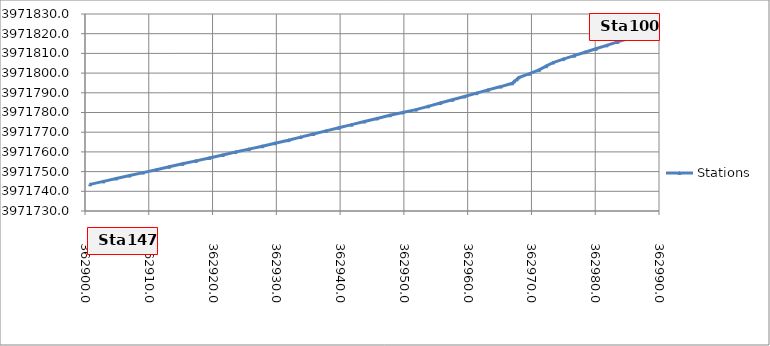
| Category | Stations |
|---|---|
| 362985.2 | 3971817.555 |
| 362983.5 | 3971815.816 |
| 362981.8 | 3971814.076 |
| 362980.1 | 3971812.337 |
| 362978.4 | 3971810.597 |
| 362976.7 | 3971808.858 |
| 362975.0 | 3971807.118 |
| 362973.4 | 3971805.364 |
| 362972.3 | 3971803.504 |
| 362971.2 | 3971801.643 |
| 362969.7 | 3971799.709 |
| 362968.0 | 3971797.777 |
| 362967.7 | 3971796.793 |
| 362967.3 | 3971795.808 |
| 362967.0 | 3971794.824 |
| 362965.2 | 3971793.161 |
| 362963.2 | 3971791.488 |
| 362961.4 | 3971789.814 |
| 362959.5 | 3971788.14 |
| 362957.6 | 3971786.466 |
| 362955.7 | 3971784.792 |
| 362953.8 | 3971783.118 |
| 362951.9 | 3971781.465 |
| 362949.8 | 3971780.038 |
| 362947.8 | 3971778.574 |
| 362945.8 | 3971776.995 |
| 362943.8 | 3971775.416 |
| 362941.8 | 3971773.836 |
| 362939.8 | 3971772.257 |
| 362937.8 | 3971770.678 |
| 362935.8 | 3971769.099 |
| 362933.8 | 3971767.519 |
| 362931.9 | 3971765.94 |
| 362929.8 | 3971764.377 |
| 362927.8 | 3971762.888 |
| 362925.7 | 3971761.399 |
| 362923.6 | 3971759.91 |
| 362921.6 | 3971758.421 |
| 362919.5 | 3971756.932 |
| 362917.4 | 3971755.443 |
| 362915.3 | 3971753.954 |
| 362913.2 | 3971752.465 |
| 362911.2 | 3971750.976 |
| 362909.1 | 3971749.488 |
| 362907.0 | 3971747.999 |
| 362904.9 | 3971746.51 |
| 362902.9 | 3971745.021 |
| 362900.8 | 3971743.532 |